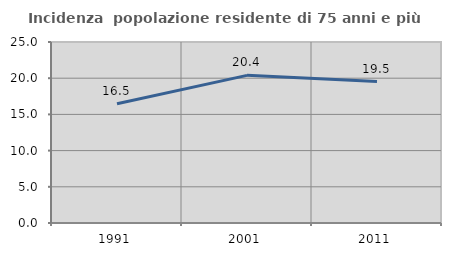
| Category | Incidenza  popolazione residente di 75 anni e più |
|---|---|
| 1991.0 | 16.463 |
| 2001.0 | 20.395 |
| 2011.0 | 19.531 |